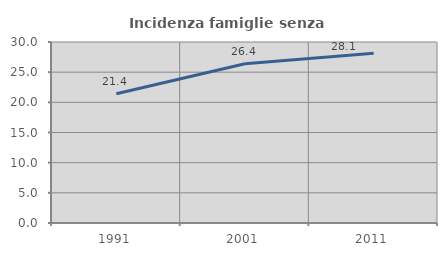
| Category | Incidenza famiglie senza nuclei |
|---|---|
| 1991.0 | 21.416 |
| 2001.0 | 26.384 |
| 2011.0 | 28.13 |